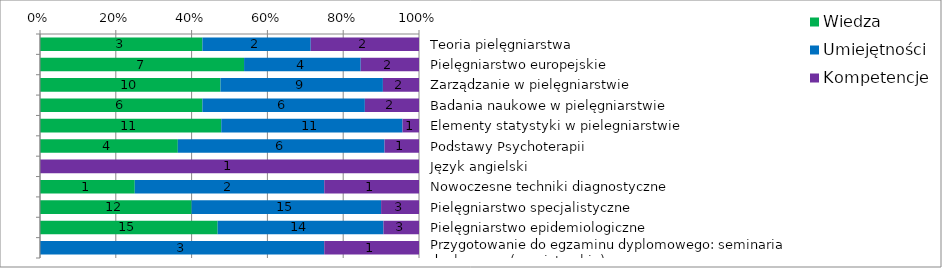
| Category | Wiedza | Umiejętności | Kompetencje |
|---|---|---|---|
| Teoria pielęgniarstwa | 3 | 2 | 2 |
| Pielęgniarstwo europejskie | 7 | 4 | 2 |
| Zarządzanie w pielęgniarstwie | 10 | 9 | 2 |
| Badania naukowe w pielęgniarstwie | 6 | 6 | 2 |
| Elementy statystyki w pielegniarstwie | 11 | 11 | 1 |
| Podstawy Psychoterapii | 4 | 6 | 1 |
| Język angielski | 0 | 0 | 1 |
| Nowoczesne techniki diagnostyczne | 1 | 2 | 1 |
| Pielęgniarstwo specjalistyczne | 12 | 15 | 3 |
| Pielęgniarstwo epidemiologiczne | 15 | 14 | 3 |
| Przygotowanie do egzaminu dyplomowego: seminaria dyplomowe (magisterskie) | 0 | 3 | 1 |